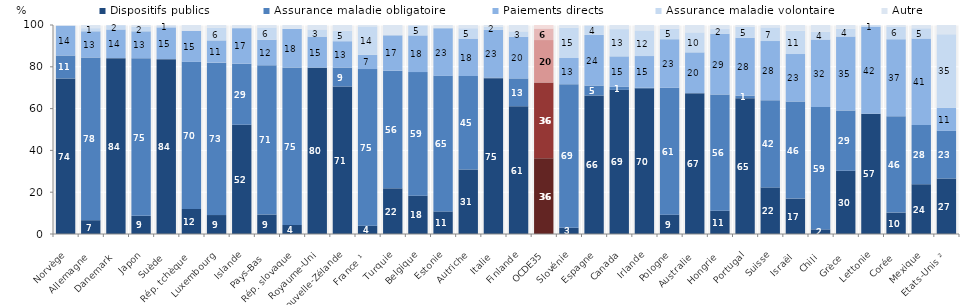
| Category | Dispositifs publics | Assurance maladie obligatoire | Paiements directs | Assurance maladie volontaire | Autre |
|---|---|---|---|---|---|
| Norvège | 74.434 | 10.963 | 14.273 | 0 | 0.33 |
| Allemagne | 6.609 | 77.861 | 12.528 | 1.475 | 1.527 |
| Danemark | 84.143 | 0 | 13.723 | 2.068 | 0.066 |
| Japon | 8.703 | 75.415 | 12.87 | 2.196 | 0.817 |
| Suède | 83.664 | 0 | 15.192 | 0.592 | 0.553 |
| Rép. tchèque | 12.015 | 70.356 | 14.828 | 0.144 | 2.657 |
| Luxembourg | 9.067 | 72.921 | 10.645 | 6.03 | 1.337 |
| Islande | 52.305 | 29.17 | 17.016 | 0 | 1.508 |
| Pays-Bas | 9.318 | 71.393 | 12.252 | 5.861 | 1.177 |
| Rép. slovaque | 4.335 | 75.381 | 18.444 | 0 | 1.84 |
| Royaume-Uni | 79.521 | 0.14 | 14.794 | 3.42 | 2.125 |
| Nouvelle-Zélande | 70.582 | 9.07 | 12.591 | 5.069 | 2.688 |
| France ¹ | 3.959 | 74.965 | 6.797 | 13.622 | 0.657 |
| Turquie | 21.861 | 56.273 | 16.948 | 0 | 4.918 |
| Belgique | 18.314 | 59.157 | 17.567 | 4.761 | 0.202 |
| Estonie | 10.796 | 64.874 | 22.772 | 0.239 | 1.319 |
| Autriche | 30.805 | 44.779 | 17.924 | 4.942 | 1.549 |
| Italie | 74.563 | 0.307 | 22.833 | 1.518 | 0.779 |
| Finlande | 61.112 | 13.335 | 19.891 | 2.591 | 3.071 |
| OCDE35 | 36.188 | 36.341 | 20.273 | 5.51 | 1.689 |
| Slovénie | 2.973 | 68.713 | 12.524 | 14.503 | 1.287 |
| Espagne | 66.3 | 4.729 | 24.229 | 4.392 | 0.35 |
| Canada | 68.968 | 1.449 | 14.585 | 13.026 | 1.972 |
| Irlande | 69.685 | 0.303 | 15.164 | 12.261 | 2.586 |
| Pologne | 9.245 | 60.743 | 23.246 | 5.039 | 1.726 |
| Australie | 67.358 | 0 | 19.558 | 9.555 | 3.529 |
| Hongrie | 11.137 | 55.592 | 29.037 | 2.287 | 1.947 |
| Portugal | 64.98 | 1.237 | 27.651 | 5.239 | 0.893 |
| Suisse | 22.292 | 41.678 | 28.346 | 6.543 | 1.142 |
| Israël | 16.944 | 46.421 | 22.742 | 11.18 | 2.714 |
| Chili | 2.204 | 58.578 | 32.241 | 3.713 | 3.265 |
| Grèce | 30.271 | 28.815 | 35.461 | 3.674 | 1.778 |
| Lettonie | 57.493 | 0 | 41.624 | 0.802 | 0.082 |
| Corée | 10.253 | 46.144 | 36.793 | 6.089 | 0.721 |
| Mexique | 23.813 | 28.356 | 41.37 | 4.892 | 1.569 |
| Etats-Unis ² | 26.551 | 22.802 | 11.084 | 35.14 | 4.423 |